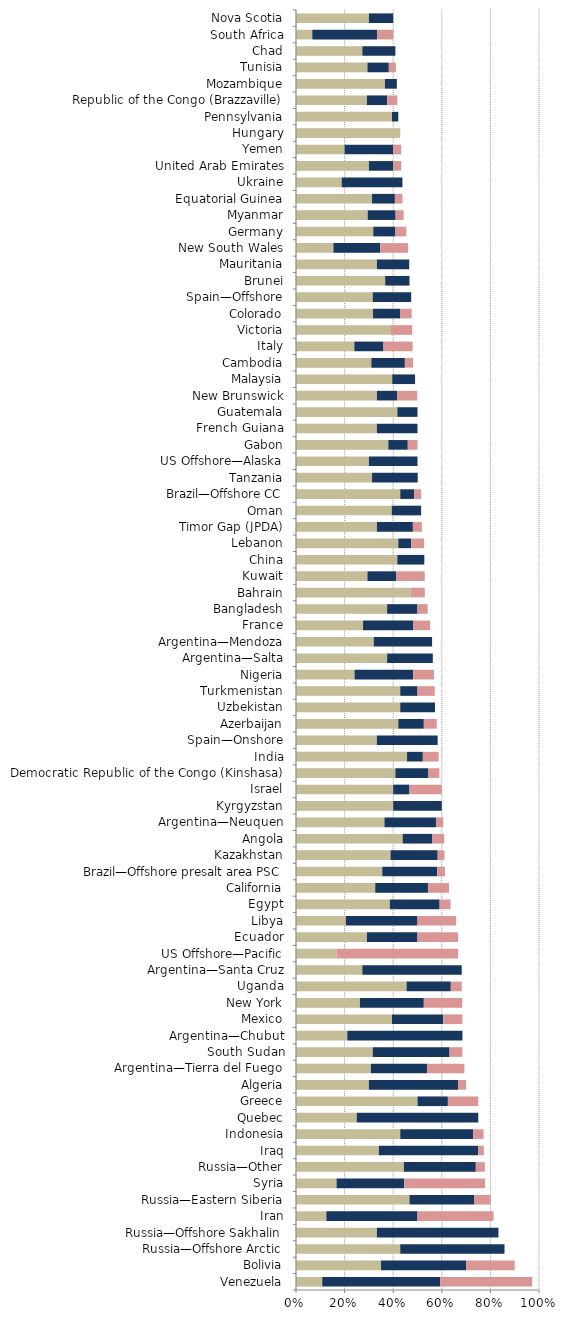
| Category |   Mild deterrent to investment |   Strong deterrent to investment |   Would not pursue investment due to this factor |
|---|---|---|---|
| Venezuela | 0.108 | 0.486 | 0.378 |
| Bolivia | 0.35 | 0.35 | 0.2 |
| Russia—Offshore Arctic | 0.429 | 0.429 | 0 |
| Russia—Offshore Sakhalin | 0.333 | 0.5 | 0 |
| Iran | 0.125 | 0.375 | 0.313 |
| Russia—Eastern Siberia | 0.467 | 0.267 | 0.067 |
| Syria | 0.167 | 0.278 | 0.333 |
| Russia—Other | 0.444 | 0.296 | 0.037 |
| Iraq | 0.341 | 0.409 | 0.023 |
| Indonesia | 0.429 | 0.3 | 0.043 |
| Quebec | 0.25 | 0.5 | 0 |
| Greece | 0.5 | 0.125 | 0.125 |
| Algeria | 0.3 | 0.367 | 0.033 |
| Argentina—Tierra del Fuego | 0.308 | 0.231 | 0.154 |
| South Sudan | 0.316 | 0.316 | 0.053 |
| Argentina—Chubut | 0.211 | 0.474 | 0 |
| Mexico | 0.395 | 0.211 | 0.079 |
| New York | 0.263 | 0.263 | 0.158 |
| Uganda | 0.455 | 0.182 | 0.045 |
| Argentina—Santa Cruz | 0.273 | 0.409 | 0 |
| US Offshore—Pacific | 0.167 | 0 | 0.5 |
| Ecuador | 0.292 | 0.208 | 0.167 |
| Libya | 0.205 | 0.295 | 0.159 |
| Egypt | 0.386 | 0.205 | 0.045 |
| California | 0.326 | 0.217 | 0.087 |
| Brazil—Offshore presalt area PSC | 0.355 | 0.226 | 0.032 |
| Kazakhstan | 0.389 | 0.194 | 0.028 |
| Angola | 0.439 | 0.122 | 0.049 |
| Argentina—Neuquen | 0.364 | 0.212 | 0.03 |
| Kyrgyzstan | 0.4 | 0.2 | 0 |
| Israel | 0.4 | 0.067 | 0.133 |
| Democratic Republic of the Congo (Kinshasa) | 0.409 | 0.136 | 0.045 |
| India | 0.457 | 0.065 | 0.065 |
| Spain—Onshore | 0.333 | 0.25 | 0 |
| Azerbaijan | 0.421 | 0.105 | 0.053 |
| Uzbekistan | 0.429 | 0.143 | 0 |
| Turkmenistan | 0.429 | 0.071 | 0.071 |
| Nigeria | 0.241 | 0.241 | 0.086 |
| Argentina—Salta | 0.375 | 0.188 | 0 |
| Argentina—Mendoza | 0.32 | 0.24 | 0 |
| France | 0.276 | 0.207 | 0.069 |
| Bangladesh | 0.375 | 0.125 | 0.042 |
| Bahrain | 0.471 | 0 | 0.059 |
| Kuwait | 0.294 | 0.118 | 0.118 |
| China | 0.417 | 0.111 | 0 |
| Lebanon | 0.421 | 0.053 | 0.053 |
| Timor Gap (JPDA) | 0.333 | 0.148 | 0.037 |
| Oman | 0.394 | 0.121 | 0 |
| Brazil—Offshore CC | 0.429 | 0.057 | 0.029 |
| Tanzania | 0.313 | 0.188 | 0 |
| US Offshore—Alaska | 0.3 | 0.2 | 0 |
| Gabon | 0.38 | 0.08 | 0.04 |
| French Guiana | 0.333 | 0.167 | 0 |
| Guatemala | 0.417 | 0.083 | 0 |
| New Brunswick | 0.333 | 0.083 | 0.083 |
| Malaysia | 0.396 | 0.094 | 0 |
| Cambodia | 0.31 | 0.138 | 0.034 |
| Italy | 0.24 | 0.12 | 0.12 |
| Victoria | 0.391 | 0 | 0.087 |
| Colorado | 0.317 | 0.111 | 0.048 |
| Spain—Offshore | 0.316 | 0.158 | 0 |
| Brunei | 0.367 | 0.1 | 0 |
| Mauritania | 0.333 | 0.133 | 0 |
| New South Wales | 0.154 | 0.192 | 0.115 |
| Germany | 0.318 | 0.091 | 0.045 |
| Myanmar | 0.295 | 0.115 | 0.033 |
| Equatorial Guinea | 0.313 | 0.094 | 0.031 |
| Ukraine | 0.188 | 0.25 | 0 |
| United Arab Emirates | 0.3 | 0.1 | 0.033 |
| Yemen | 0.2 | 0.2 | 0.033 |
| Hungary | 0.429 | 0 | 0 |
| Pennsylvania | 0.395 | 0.026 | 0 |
| Republic of the Congo (Brazzaville) | 0.292 | 0.083 | 0.042 |
| Mozambique | 0.366 | 0.049 | 0 |
| Tunisia | 0.294 | 0.088 | 0.029 |
| Chad | 0.273 | 0.136 | 0 |
| South Africa | 0.067 | 0.267 | 0.067 |
| Nova Scotia | 0.3 | 0.1 | 0 |